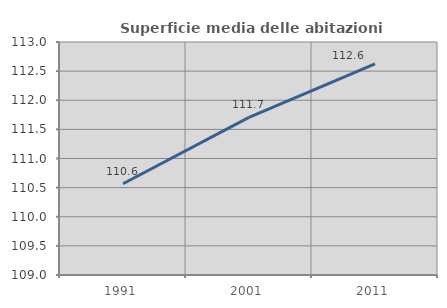
| Category | Superficie media delle abitazioni occupate |
|---|---|
| 1991.0 | 110.567 |
| 2001.0 | 111.705 |
| 2011.0 | 112.626 |